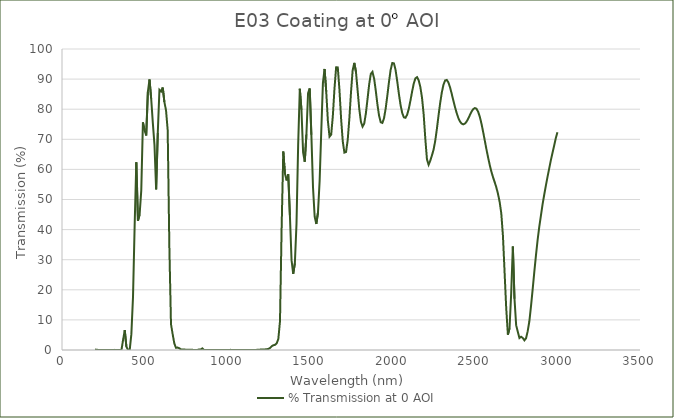
| Category | % Transmission at 0 AOI |
|---|---|
| 200.0 | 0.154 |
| 210.0 | 0.078 |
| 220.0 | 0.016 |
| 230.0 | 0.014 |
| 240.0 | 0.004 |
| 250.0 | 0.011 |
| 260.0 | 0.009 |
| 270.0 | 0.014 |
| 280.0 | 0.028 |
| 290.0 | 0.039 |
| 300.0 | 0.016 |
| 310.0 | 0.007 |
| 320.0 | 0.041 |
| 330.0 | 0.011 |
| 340.0 | 0.013 |
| 350.0 | 0 |
| 360.0 | 0.011 |
| 370.0 | 3.377 |
| 380.0 | 6.617 |
| 390.0 | 1.082 |
| 400.0 | 0.018 |
| 410.0 | 0.009 |
| 420.0 | 5.266 |
| 430.0 | 17.644 |
| 440.0 | 41.533 |
| 450.0 | 62.386 |
| 460.0 | 42.958 |
| 470.0 | 44.982 |
| 480.0 | 53.035 |
| 490.0 | 75.623 |
| 500.0 | 73.001 |
| 510.0 | 71.279 |
| 520.0 | 85.806 |
| 530.0 | 89.879 |
| 540.0 | 83.545 |
| 550.0 | 75.448 |
| 560.0 | 68.141 |
| 570.0 | 53.355 |
| 580.0 | 72.069 |
| 590.0 | 86.427 |
| 600.0 | 85.901 |
| 610.0 | 87.211 |
| 620.0 | 82.393 |
| 630.0 | 79.603 |
| 640.0 | 73.009 |
| 650.0 | 34.449 |
| 660.0 | 8.562 |
| 670.0 | 5.272 |
| 680.0 | 2.22 |
| 690.0 | 0.735 |
| 700.0 | 0.814 |
| 710.0 | 0.59 |
| 720.0 | 0.192 |
| 730.0 | 0.136 |
| 740.0 | 0.15 |
| 750.0 | 0.11 |
| 760.0 | 0.058 |
| 770.0 | 0.068 |
| 780.0 | 0.049 |
| 790.0 | 0.045 |
| 800.0 | 0.03 |
| 810.0 | 0.001 |
| 820.0 | 0.004 |
| 830.0 | 0.183 |
| 840.0 | 0.168 |
| 850.0 | 0.54 |
| 860.0 | 0.005 |
| 870.0 | 0.007 |
| 880.0 | 0.006 |
| 890.0 | 0.011 |
| 900.0 | 0.011 |
| 910.0 | 0.013 |
| 920.0 | 0.03 |
| 930.0 | 0.036 |
| 940.0 | 0.002 |
| 950.0 | 0.028 |
| 960.0 | 0.02 |
| 970.0 | 0.012 |
| 980.0 | 0.001 |
| 990.0 | 0.018 |
| 1000.0 | 0.028 |
| 1010.0 | 0.008 |
| 1020.0 | 0.046 |
| 1030.0 | 0.029 |
| 1040.0 | 0.003 |
| 1050.0 | 0.004 |
| 1060.0 | 0.013 |
| 1070.0 | 0.038 |
| 1080.0 | 0.024 |
| 1090.0 | 0.004 |
| 1100.0 | 0.024 |
| 1110.0 | 0.025 |
| 1120.0 | 0.006 |
| 1130.0 | 0.02 |
| 1140.0 | 0.03 |
| 1150.0 | 0.007 |
| 1160.0 | 0.012 |
| 1170.0 | 0.015 |
| 1180.0 | 0.046 |
| 1190.0 | 0.092 |
| 1200.0 | 0.129 |
| 1210.0 | 0.147 |
| 1220.0 | 0.164 |
| 1230.0 | 0.202 |
| 1240.0 | 0.247 |
| 1250.0 | 0.359 |
| 1260.0 | 0.695 |
| 1270.0 | 1.263 |
| 1280.0 | 1.584 |
| 1290.0 | 1.723 |
| 1300.0 | 2.226 |
| 1310.0 | 3.66 |
| 1320.0 | 9.562 |
| 1330.0 | 40.724 |
| 1340.0 | 65.935 |
| 1350.0 | 58.628 |
| 1360.0 | 56.332 |
| 1370.0 | 58.374 |
| 1380.0 | 44.786 |
| 1390.0 | 29.855 |
| 1400.0 | 25.313 |
| 1410.0 | 28.764 |
| 1420.0 | 41.959 |
| 1430.0 | 68.1 |
| 1440.0 | 86.808 |
| 1450.0 | 79.793 |
| 1460.0 | 65.677 |
| 1470.0 | 62.556 |
| 1480.0 | 71.576 |
| 1490.0 | 85.345 |
| 1500.0 | 86.899 |
| 1510.0 | 71.5 |
| 1520.0 | 53.997 |
| 1530.0 | 44.275 |
| 1540.0 | 41.87 |
| 1550.0 | 45.669 |
| 1560.0 | 56.147 |
| 1570.0 | 72.745 |
| 1580.0 | 88.744 |
| 1590.0 | 93.358 |
| 1600.0 | 85.878 |
| 1610.0 | 76.112 |
| 1620.0 | 70.87 |
| 1630.0 | 71.545 |
| 1640.0 | 77.719 |
| 1650.0 | 86.844 |
| 1660.0 | 93.923 |
| 1670.0 | 93.885 |
| 1680.0 | 86.514 |
| 1690.0 | 76.908 |
| 1700.0 | 69.397 |
| 1710.0 | 65.568 |
| 1720.0 | 65.79 |
| 1730.0 | 69.768 |
| 1740.0 | 76.843 |
| 1750.0 | 85.615 |
| 1760.0 | 92.928 |
| 1770.0 | 95.388 |
| 1780.0 | 92.416 |
| 1790.0 | 86.313 |
| 1800.0 | 80.106 |
| 1810.0 | 75.853 |
| 1820.0 | 74.219 |
| 1830.0 | 75.207 |
| 1840.0 | 78.57 |
| 1850.0 | 83.344 |
| 1860.0 | 88.244 |
| 1870.0 | 91.728 |
| 1880.0 | 92.408 |
| 1890.0 | 90.197 |
| 1900.0 | 86.158 |
| 1910.0 | 81.583 |
| 1920.0 | 77.81 |
| 1930.0 | 75.665 |
| 1940.0 | 75.437 |
| 1950.0 | 77.016 |
| 1960.0 | 80.237 |
| 1970.0 | 84.493 |
| 1980.0 | 89.079 |
| 1990.0 | 93.079 |
| 2000.0 | 95.34 |
| 2010.0 | 95.241 |
| 2020.0 | 92.984 |
| 2030.0 | 89.261 |
| 2040.0 | 85.084 |
| 2050.0 | 81.425 |
| 2060.0 | 78.764 |
| 2070.0 | 77.306 |
| 2080.0 | 77.155 |
| 2090.0 | 78.178 |
| 2100.0 | 80.148 |
| 2110.0 | 82.852 |
| 2120.0 | 85.846 |
| 2130.0 | 88.511 |
| 2140.0 | 90.256 |
| 2150.0 | 90.635 |
| 2160.0 | 89.581 |
| 2170.0 | 87.325 |
| 2180.0 | 83.833 |
| 2190.0 | 78.309 |
| 2200.0 | 70.176 |
| 2210.0 | 63.311 |
| 2220.0 | 61.543 |
| 2230.0 | 62.904 |
| 2240.0 | 64.617 |
| 2250.0 | 66.553 |
| 2260.0 | 69.458 |
| 2270.0 | 73.425 |
| 2280.0 | 77.894 |
| 2290.0 | 82.078 |
| 2300.0 | 85.578 |
| 2310.0 | 88.153 |
| 2320.0 | 89.556 |
| 2330.0 | 89.72 |
| 2340.0 | 88.867 |
| 2350.0 | 87.231 |
| 2360.0 | 85.093 |
| 2370.0 | 82.8 |
| 2380.0 | 80.646 |
| 2390.0 | 78.703 |
| 2400.0 | 77.064 |
| 2410.0 | 75.905 |
| 2420.0 | 75.204 |
| 2430.0 | 74.965 |
| 2440.0 | 75.216 |
| 2450.0 | 75.875 |
| 2460.0 | 76.87 |
| 2470.0 | 78.061 |
| 2480.0 | 79.19 |
| 2490.0 | 80.024 |
| 2500.0 | 80.394 |
| 2510.0 | 80.136 |
| 2520.0 | 79.13 |
| 2530.0 | 77.463 |
| 2540.0 | 75.204 |
| 2550.0 | 72.516 |
| 2560.0 | 69.623 |
| 2570.0 | 66.695 |
| 2580.0 | 64.015 |
| 2590.0 | 61.488 |
| 2600.0 | 59.27 |
| 2610.0 | 57.412 |
| 2620.0 | 55.779 |
| 2630.0 | 54.037 |
| 2640.0 | 51.885 |
| 2650.0 | 49.239 |
| 2660.0 | 45.425 |
| 2670.0 | 37.96 |
| 2680.0 | 25.877 |
| 2690.0 | 13.78 |
| 2700.0 | 5.105 |
| 2710.0 | 7.187 |
| 2720.0 | 18.834 |
| 2730.0 | 34.366 |
| 2740.0 | 17.007 |
| 2750.0 | 8.249 |
| 2760.0 | 6.036 |
| 2770.0 | 3.974 |
| 2780.0 | 4.394 |
| 2790.0 | 4.015 |
| 2800.0 | 3.216 |
| 2810.0 | 3.925 |
| 2820.0 | 6.262 |
| 2830.0 | 9.549 |
| 2840.0 | 14.592 |
| 2850.0 | 20.145 |
| 2860.0 | 25.953 |
| 2870.0 | 31.434 |
| 2880.0 | 36.548 |
| 2890.0 | 40.867 |
| 2900.0 | 44.674 |
| 2910.0 | 48.368 |
| 2920.0 | 51.588 |
| 2930.0 | 54.631 |
| 2940.0 | 57.502 |
| 2950.0 | 60.262 |
| 2960.0 | 63.003 |
| 2970.0 | 65.478 |
| 2980.0 | 67.871 |
| 2990.0 | 70.327 |
| 3000.0 | 72.372 |